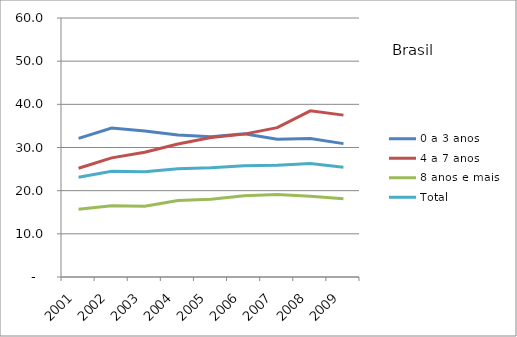
| Category | 0 a 3 anos | 4 a 7 anos | 8 anos e mais | Total |
|---|---|---|---|---|
| 2001.0 | 32.1 | 25.2 | 15.7 | 23.1 |
| 2002.0 | 34.5 | 27.6 | 16.5 | 24.5 |
| 2003.0 | 33.8 | 28.9 | 16.4 | 24.4 |
| 2004.0 | 32.9 | 30.8 | 17.7 | 25.1 |
| 2005.0 | 32.5 | 32.3 | 18 | 25.3 |
| 2006.0 | 33.2 | 33.1 | 18.8 | 25.8 |
| 2007.0 | 31.9 | 34.6 | 19.1 | 25.9 |
| 2008.0 | 32.1 | 38.5 | 18.7 | 26.3 |
| 2009.0 | 30.9 | 37.5 | 18.1 | 25.4 |